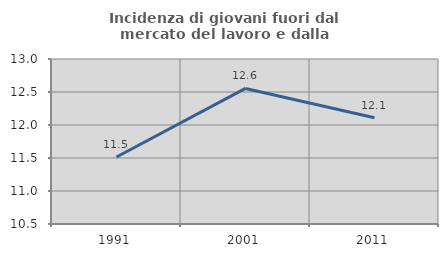
| Category | Incidenza di giovani fuori dal mercato del lavoro e dalla formazione  |
|---|---|
| 1991.0 | 11.515 |
| 2001.0 | 12.554 |
| 2011.0 | 12.109 |